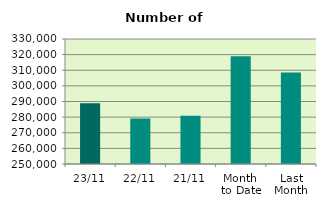
| Category | Series 0 |
|---|---|
| 23/11 | 288816 |
| 22/11 | 279084 |
| 21/11 | 280806 |
| Month 
to Date | 319029.529 |
| Last
Month | 308508.19 |